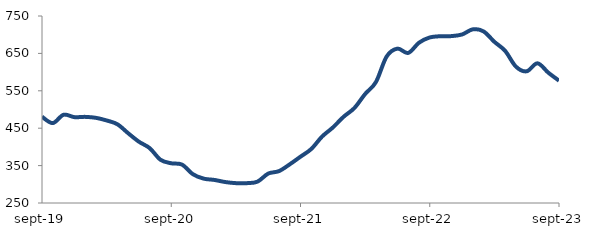
| Category | Series 0 |
|---|---|
| 2019-09-01 | 480.652 |
| 2019-10-01 | 463.67 |
| 2019-11-01 | 485.887 |
| 2019-12-01 | 479.593 |
| 2020-01-01 | 480.293 |
| 2020-02-01 | 477.774 |
| 2020-03-01 | 470.708 |
| 2020-04-01 | 460.537 |
| 2020-05-01 | 436.562 |
| 2020-06-01 | 413.857 |
| 2020-07-01 | 396.652 |
| 2020-08-01 | 365.687 |
| 2020-09-01 | 356.18 |
| 2020-10-01 | 352.658 |
| 2020-11-01 | 327.164 |
| 2020-12-01 | 315.173 |
| 2021-01-01 | 311.708 |
| 2021-02-01 | 306.103 |
| 2021-03-01 | 303.075 |
| 2021-04-01 | 303.034 |
| 2021-05-01 | 306.996 |
| 2021-06-01 | 328.614 |
| 2021-07-01 | 335.232 |
| 2021-08-01 | 353.414 |
| 2021-09-01 | 373.869 |
| 2021-10-01 | 394.393 |
| 2021-11-01 | 427.592 |
| 2021-12-01 | 451.83 |
| 2022-01-01 | 480.528 |
| 2022-02-01 | 503.882 |
| 2022-03-01 | 541.428 |
| 2022-04-01 | 573.261 |
| 2022-05-01 | 641.774 |
| 2022-06-01 | 662.728 |
| 2022-07-01 | 651.267 |
| 2022-08-01 | 678.506 |
| 2022-09-01 | 692.688 |
| 2022-10-01 | 695.873 |
| 2022-11-01 | 696.235 |
| 2022-12-01 | 700.598 |
| 2023-01-01 | 714.422 |
| 2023-02-01 | 708.75 |
| 2023-03-01 | 680.994 |
| 2023-04-01 | 656.708 |
| 2023-05-01 | 614.698 |
| 2023-06-01 | 602.139 |
| 2023-07-01 | 623.52 |
| 2023-08-01 | 598.686 |
| 2023-09-01 | 577.1 |